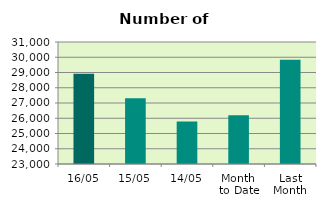
| Category | Series 0 |
|---|---|
| 16/05 | 28924 |
| 15/05 | 27312 |
| 14/05 | 25786 |
| Month 
to Date | 26202.727 |
| Last
Month | 29833 |